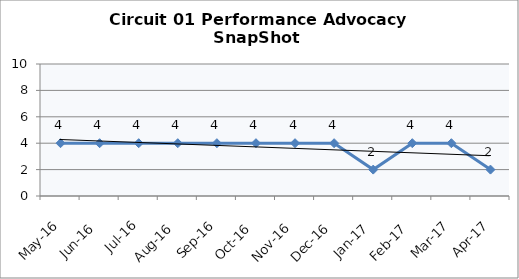
| Category | Circuit 01 |
|---|---|
| May-16 | 4 |
| Jun-16 | 4 |
| Jul-16 | 4 |
| Aug-16 | 4 |
| Sep-16 | 4 |
| Oct-16 | 4 |
| Nov-16 | 4 |
| Dec-16 | 4 |
| Jan-17 | 2 |
| Feb-17 | 4 |
| Mar-17 | 4 |
| Apr-17 | 2 |